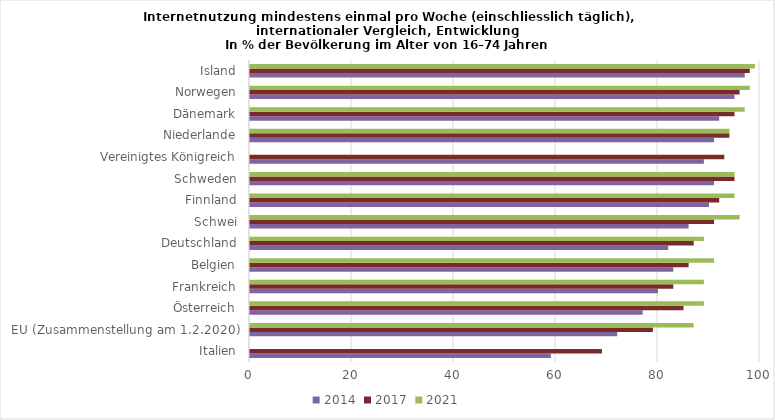
| Category | 2014 | 2017 | 2021 |
|---|---|---|---|
| Italien | 59 | 69 | 0 |
| EU (Zusammenstellung am 1.2.2020) | 72 | 79 | 87 |
| Österreich | 77 | 85 | 89 |
| Frankreich | 80 | 83 | 89 |
| Belgien | 83 | 86 | 91 |
| Deutschland | 82 | 87 | 89 |
| Schwei | 86 | 91 | 96 |
| Finnland | 90 | 92 | 95 |
| Schweden | 91 | 95 | 95 |
| Vereinigtes Königreich | 89 | 93 | 0 |
| Niederlande | 91 | 94 | 94 |
| Dänemark | 92 | 95 | 97 |
| Norwegen | 95 | 96 | 98 |
| Island | 97 | 98 | 99 |